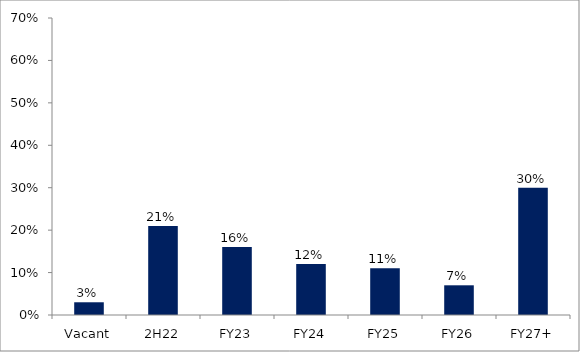
| Category | Series 0 |
|---|---|
| Vacant | 0.03 |
| 2H22 | 0.21 |
| FY23 | 0.16 |
| FY24 | 0.12 |
| FY25 | 0.11 |
| FY26 | 0.07 |
| FY27+ | 0.3 |